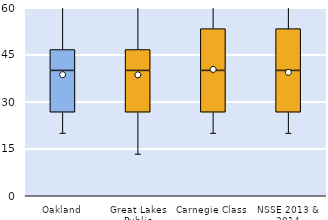
| Category | 25th | 50th | 75th |
|---|---|---|---|
| Oakland | 26.667 | 13.333 | 6.667 |
| Great Lakes Public | 26.667 | 13.333 | 6.667 |
| Carnegie Class | 26.667 | 13.333 | 13.333 |
| NSSE 2013 & 2014 | 26.667 | 13.333 | 13.333 |